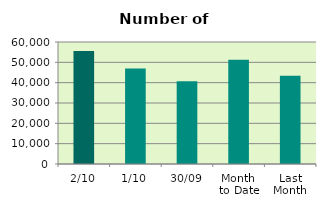
| Category | Series 0 |
|---|---|
| 2/10 | 55568 |
| 1/10 | 46946 |
| 30/09 | 40736 |
| Month 
to Date | 51257 |
| Last
Month | 43452.667 |